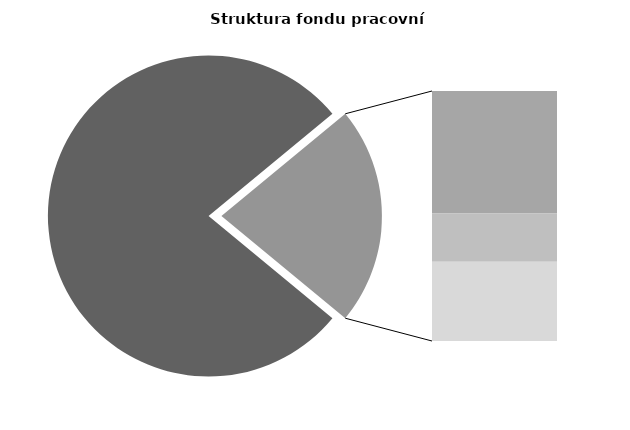
| Category | Series 0 |
|---|---|
| Průměrná měsíční odpracovaná doba bez přesčasu | 135.181 |
| Dovolená | 18.624 |
| Nemoc | 7.36 |
| Jiné | 12.061 |